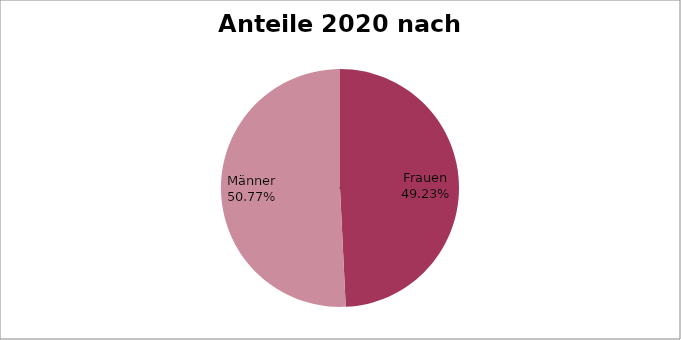
| Category | Series 0 |
|---|---|
| Frauen | 0.492 |
| Männer | 0.508 |